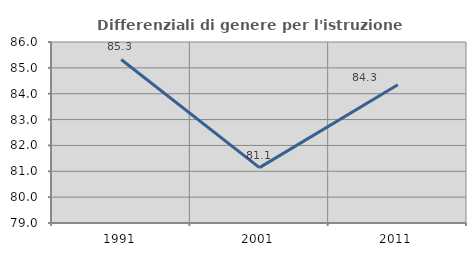
| Category | Differenziali di genere per l'istruzione superiore |
|---|---|
| 1991.0 | 85.325 |
| 2001.0 | 81.141 |
| 2011.0 | 84.348 |